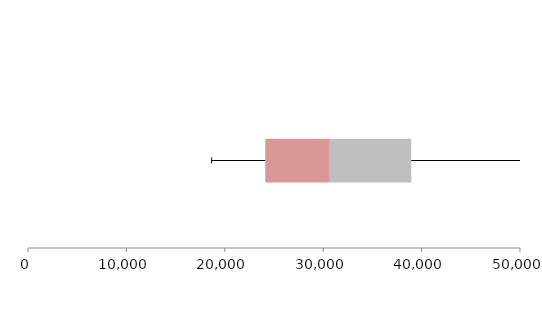
| Category | Series 1 | Series 2 | Series 3 |
|---|---|---|---|
| 0 | 24113.639 | 6558.959 | 8278.892 |